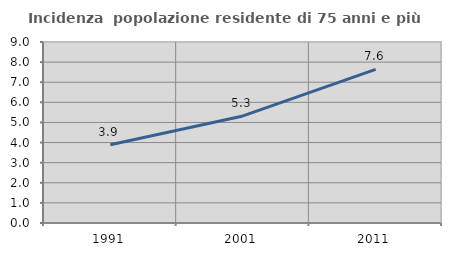
| Category | Incidenza  popolazione residente di 75 anni e più |
|---|---|
| 1991.0 | 3.895 |
| 2001.0 | 5.323 |
| 2011.0 | 7.641 |